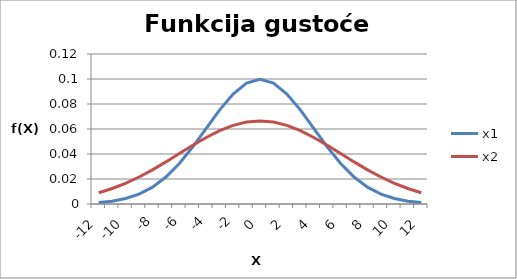
| Category | x1 | x2 |
|---|---|---|
| -12.0 | 0.001 | 0.009 |
| -11.0 | 0.002 | 0.012 |
| -10.0 | 0.004 | 0.017 |
| -9.0 | 0.008 | 0.022 |
| -8.0 | 0.013 | 0.027 |
| -7.0 | 0.022 | 0.034 |
| -6.0 | 0.032 | 0.04 |
| -5.0 | 0.046 | 0.047 |
| -4.0 | 0.06 | 0.053 |
| -3.0 | 0.075 | 0.059 |
| -2.0 | 0.088 | 0.063 |
| -1.0 | 0.097 | 0.066 |
| 0.0 | 0.1 | 0.066 |
| 1.0 | 0.097 | 0.066 |
| 2.0 | 0.088 | 0.063 |
| 3.0 | 0.075 | 0.059 |
| 4.0 | 0.06 | 0.053 |
| 5.0 | 0.046 | 0.047 |
| 6.0 | 0.032 | 0.04 |
| 7.0 | 0.022 | 0.034 |
| 8.0 | 0.013 | 0.027 |
| 9.0 | 0.008 | 0.022 |
| 10.0 | 0.004 | 0.017 |
| 11.0 | 0.002 | 0.012 |
| 12.0 | 0.001 | 0.009 |